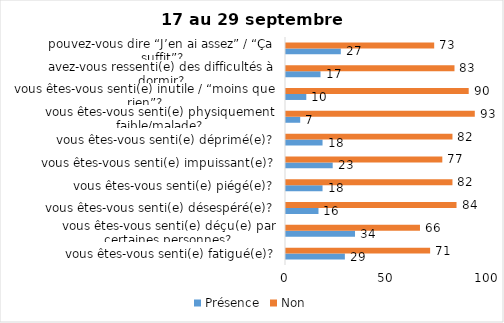
| Category | Présence | Non |
|---|---|---|
| vous êtes-vous senti(e) fatigué(e)? | 29 | 71 |
| vous êtes-vous senti(e) déçu(e) par certaines personnes? | 34 | 66 |
| vous êtes-vous senti(e) désespéré(e)? | 16 | 84 |
| vous êtes-vous senti(e) piégé(e)? | 18 | 82 |
| vous êtes-vous senti(e) impuissant(e)? | 23 | 77 |
| vous êtes-vous senti(e) déprimé(e)? | 18 | 82 |
| vous êtes-vous senti(e) physiquement faible/malade? | 7 | 93 |
| vous êtes-vous senti(e) inutile / “moins que rien”? | 10 | 90 |
| avez-vous ressenti(e) des difficultés à dormir? | 17 | 83 |
| pouvez-vous dire “J’en ai assez” / “Ça suffit”? | 27 | 73 |